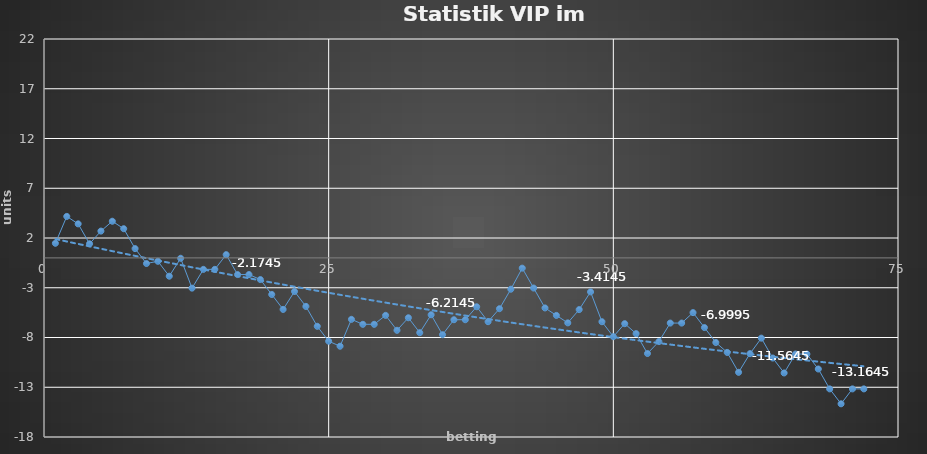
| Category | Series 0 |
|---|---|
| 0 | 1.47 |
| 1 | 4.17 |
| 2 | 3.42 |
| 3 | 1.42 |
| 4 | 2.695 |
| 5 | 3.685 |
| 6 | 2.935 |
| 7 | 0.935 |
| 8 | -0.565 |
| 9 | -0.338 |
| 10 | -1.838 |
| 11 | -0.038 |
| 12 | -3.038 |
| 13 | -1.152 |
| 14 | -1.152 |
| 15 | 0.325 |
| 16 | -1.674 |
| 17 | -1.674 |
| 18 | -2.174 |
| 19 | -3.674 |
| 20 | -5.174 |
| 21 | -3.375 |
| 22 | -4.874 |
| 23 | -6.874 |
| 24 | -8.375 |
| 25 | -8.875 |
| 26 | -6.175 |
| 27 | -6.675 |
| 28 | -6.675 |
| 29 | -5.775 |
| 30 | -7.275 |
| 31 | -6.015 |
| 32 | -7.515 |
| 33 | -5.715 |
| 34 | -7.715 |
| 35 | -6.215 |
| 36 | -6.215 |
| 37 | -4.91 |
| 38 | -6.41 |
| 39 | -5.105 |
| 40 | -3.145 |
| 41 | -1.03 |
| 42 | -3.03 |
| 43 | -5.03 |
| 44 | -5.78 |
| 45 | -6.53 |
| 46 | -5.195 |
| 47 | -3.415 |
| 48 | -6.415 |
| 49 | -7.915 |
| 50 | -6.61 |
| 51 | -7.61 |
| 52 | -9.61 |
| 53 | -8.41 |
| 54 | -6.55 |
| 55 | -6.55 |
| 56 | -5.5 |
| 57 | -7 |
| 58 | -8.5 |
| 59 | -9.5 |
| 60 | -11.5 |
| 61 | -9.625 |
| 62 | -8.065 |
| 63 | -10.064 |
| 64 | -11.564 |
| 65 | -9.664 |
| 66 | -9.664 |
| 67 | -11.164 |
| 68 | -13.164 |
| 69 | -14.664 |
| 70 | -13.164 |
| 71 | -13.164 |